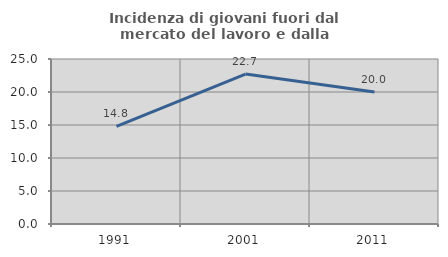
| Category | Incidenza di giovani fuori dal mercato del lavoro e dalla formazione  |
|---|---|
| 1991.0 | 14.805 |
| 2001.0 | 22.724 |
| 2011.0 | 20.014 |